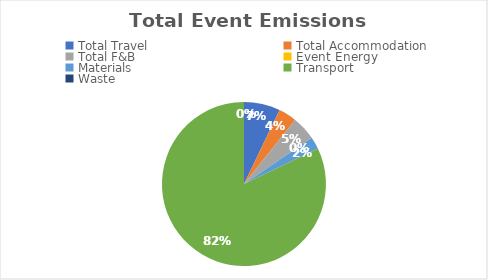
| Category | Series 0 |
|---|---|
| Total Travel | 0.06 |
| Total Accommodation | 0.03 |
| Total F&B | 0.04 |
| Event Energy | 0 |
| Materials | 0.02 |
| Transport | 0.69 |
| Waste | 0 |